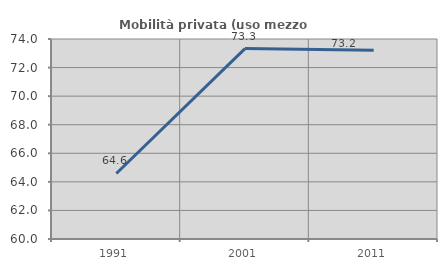
| Category | Mobilità privata (uso mezzo privato) |
|---|---|
| 1991.0 | 64.587 |
| 2001.0 | 73.327 |
| 2011.0 | 73.206 |